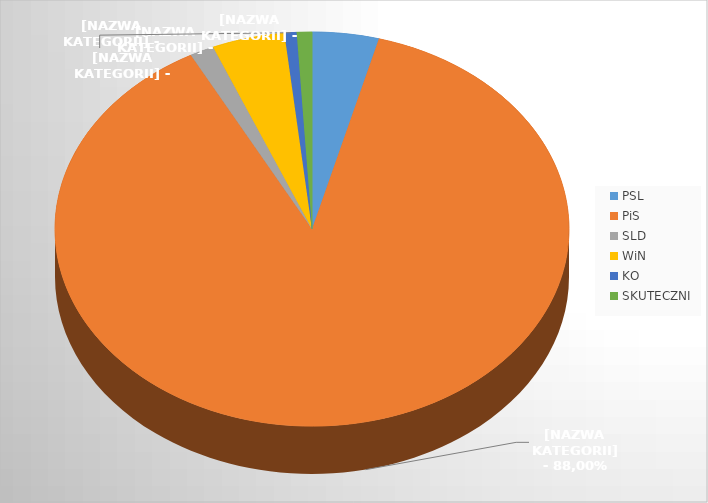
| Category | Series 0 |
|---|---|
| PSL | 22 |
| PiS | 462 |
| SLD | 8 |
| WiN | 24 |
| KO | 4 |
| SKUTECZNI | 5 |